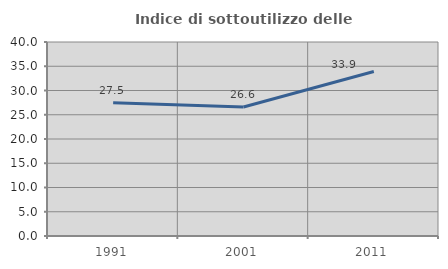
| Category | Indice di sottoutilizzo delle abitazioni  |
|---|---|
| 1991.0 | 27.496 |
| 2001.0 | 26.597 |
| 2011.0 | 33.923 |